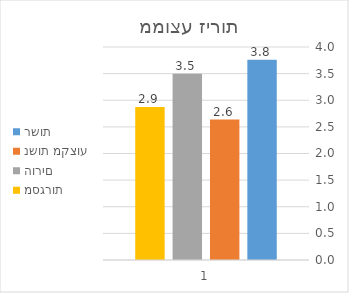
| Category | רשות | נשות מקצוע | הורים | מסגרות |
|---|---|---|---|---|
| 0 | 3.762 | 2.636 | 3.5 | 2.875 |